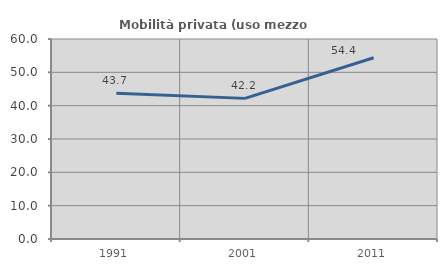
| Category | Mobilità privata (uso mezzo privato) |
|---|---|
| 1991.0 | 43.697 |
| 2001.0 | 42.188 |
| 2011.0 | 54.386 |